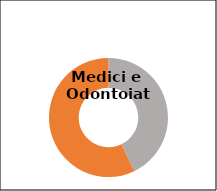
| Category | Series 0 |
|---|---|
| Donne  | 0.429 |
| Uomini  | 0.571 |